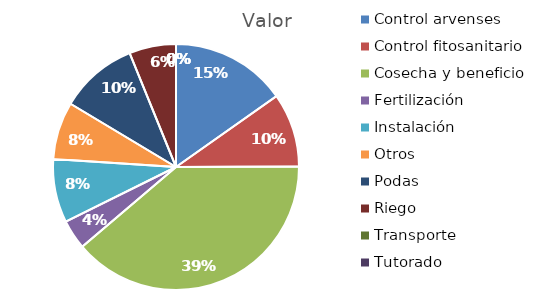
| Category | Valor |
|---|---|
| Control arvenses | 7645584 |
| Control fitosanitario | 4880160 |
| Cosecha y beneficio | 19520640 |
| Fertilización | 1952064 |
| Instalación | 4204067 |
| Otros | 3795680 |
| Podas | 5151280 |
| Riego | 3090768 |
| Transporte | 0 |
| Tutorado | 0 |